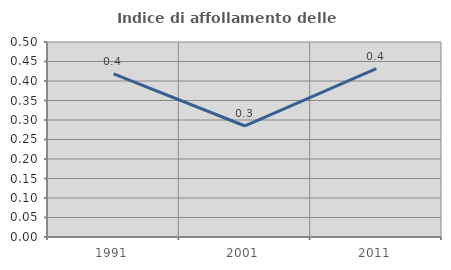
| Category | Indice di affollamento delle abitazioni  |
|---|---|
| 1991.0 | 0.418 |
| 2001.0 | 0.285 |
| 2011.0 | 0.432 |